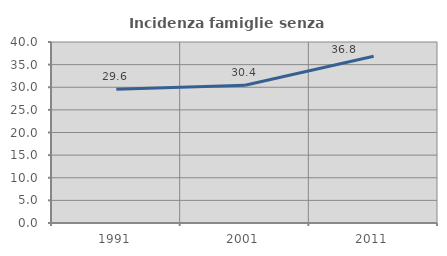
| Category | Incidenza famiglie senza nuclei |
|---|---|
| 1991.0 | 29.565 |
| 2001.0 | 30.446 |
| 2011.0 | 36.847 |